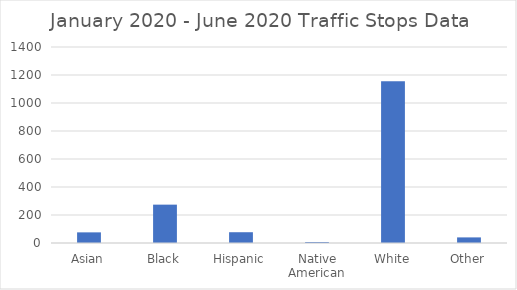
| Category | Series 0 |
|---|---|
| Asian | 76 |
| Black | 274 |
| Hispanic | 77 |
| Native American | 7 |
| White | 1155 |
| Other | 40 |